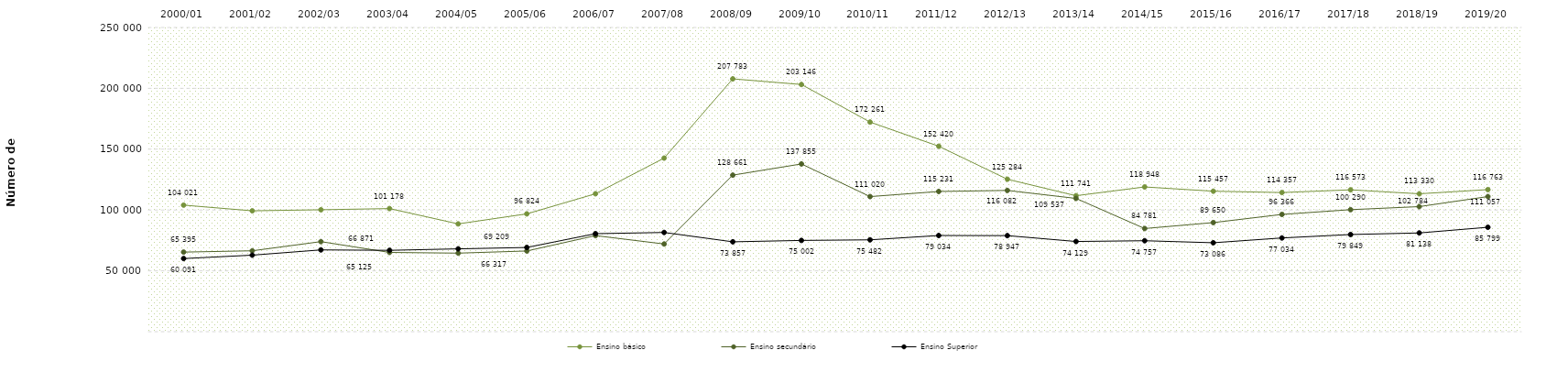
| Category | Ensino básico | Ensino secundário | Ensino Superior |
|---|---|---|---|
| 2000/01 | 104021 | 65395 | 60091 |
| 2001/02 | 99332 | 66477 | 62897 |
| 2002/03 | 100204 | 74013 | 67216 |
| 2003/04 | 101178 | 65125 | 66871 |
| 2004/05 | 88593 | 64559 | 68073 |
| 2005/06 | 96824 | 66317 | 69209 |
| 2006/07 | 113361 | 78951 | 80541 |
| 2007/08 | 142649 | 72066 | 81539 |
| 2008/09 | 207783 | 128661 | 73857 |
| 2009/10 | 203146 | 137855 | 75002 |
| 2010/11 | 172261 | 111020 | 75482 |
| 2011/12 | 152420 | 115231 | 79034 |
| 2012/13 | 125284 | 116082 | 78947 |
| 2013/14 | 111741 | 109537 | 74129 |
| 2014/15 | 118948 | 84781 | 74757 |
| 2015/16 | 115457 | 89650 | 73086 |
| 2016/17 | 114357 | 96366 | 77034 |
| 2017/18 | 116573 | 100290 | 79849 |
| 2018/19 | 113330 | 102784 | 81138 |
| 2019/20 | 116763 | 111057 | 85799 |